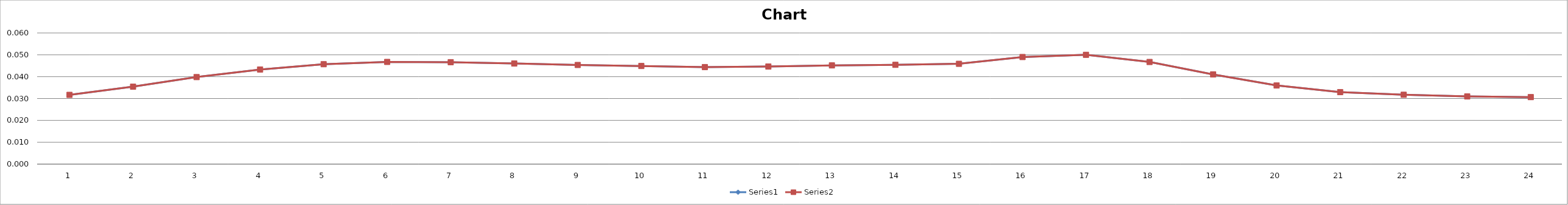
| Category | Series 0 | Series 1 |
|---|---|---|
| 0 | 0.032 | 0.032 |
| 1 | 0.035 | 0.035 |
| 2 | 0.04 | 0.04 |
| 3 | 0.043 | 0.043 |
| 4 | 0.046 | 0.046 |
| 5 | 0.047 | 0.047 |
| 6 | 0.047 | 0.047 |
| 7 | 0.046 | 0.046 |
| 8 | 0.045 | 0.045 |
| 9 | 0.045 | 0.045 |
| 10 | 0.044 | 0.044 |
| 11 | 0.045 | 0.045 |
| 12 | 0.045 | 0.045 |
| 13 | 0.045 | 0.045 |
| 14 | 0.046 | 0.046 |
| 15 | 0.049 | 0.049 |
| 16 | 0.05 | 0.05 |
| 17 | 0.047 | 0.047 |
| 18 | 0.041 | 0.041 |
| 19 | 0.036 | 0.036 |
| 20 | 0.033 | 0.033 |
| 21 | 0.032 | 0.032 |
| 22 | 0.031 | 0.031 |
| 23 | 0.031 | 0.031 |